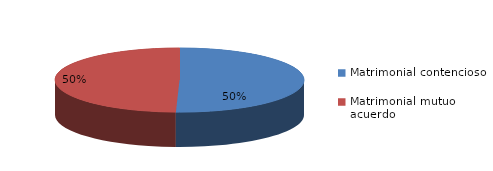
| Category | Series 0 |
|---|---|
| 0 | 2408 |
| 1 | 2364 |